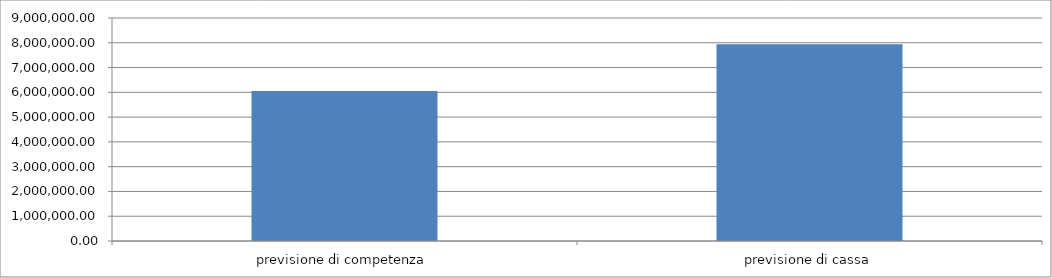
| Category | Series 0 |
|---|---|
| previsione di competenza | 6057492.84 |
| previsione di cassa | 7939143.48 |